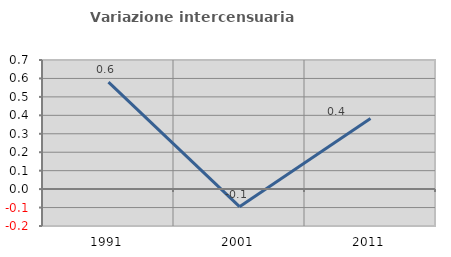
| Category | Variazione intercensuaria annua |
|---|---|
| 1991.0 | 0.58 |
| 2001.0 | -0.095 |
| 2011.0 | 0.383 |